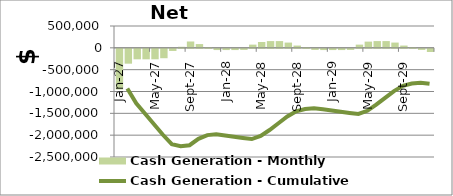
| Category | Cash Generation - Monthly |
|---|---|
| 0 | -931000 |
| 1900-01-01 | -340000 |
| 1900-01-02 | -240000 |
| 1900-01-03 | -240000 |
| 1900-01-04 | -240000 |
| 1900-01-05 | -215000 |
| 1900-01-06 | -48600 |
| 1900-01-07 | 24600 |
| 1900-01-08 | 145268.422 |
| 1900-01-09 | 86074.679 |
| 1900-01-10 | 17766.232 |
| 1900-01-11 | -28000 |
| 1900-01-12 | -28000 |
| 1900-01-13 | -28000 |
| 1900-01-14 | -24200 |
| 1900-01-15 | 73400 |
| 1900-01-16 | 133642.759 |
| 1900-01-17 | 154478.619 |
| 1900-01-18 | 154487.825 |
| 1900-01-19 | 120336.766 |
| 1900-01-20 | 52025.447 |
| 1900-01-21 | 17873.874 |
| 1900-01-22 | -24200 |
| 1900-01-23 | -28000 |
| 1900-01-24 | -28000 |
| 1900-01-25 | -28000 |
| 1900-01-26 | -24200 |
| 1900-01-27 | 73400 |
| 1900-01-28 | 142192.869 |
| 1900-01-29 | 154572.786 |
| 1900-01-30 | 154579.163 |
| 1900-01-31 | 120425.336 |
| 1900-02-01 | 52111.309 |
| 1900-02-02 | 17957.089 |
| 1900-02-03 | -24200 |
| 1900-02-04 | -73000 |